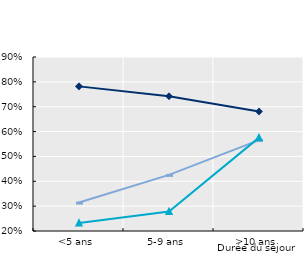
| Category | Travail | Famille | Humanitaire | Series 4 | Series 5 | Series 6 |
|---|---|---|---|---|---|---|
| <5 ans | 0.782 | 0.314 | 0.232 |  |  |  |
| 5-9 ans | 0.742 | 0.426 | 0.278 |  |  |  |
| >10 ans | 0.68 | 0.566 | 0.576 |  |  |  |